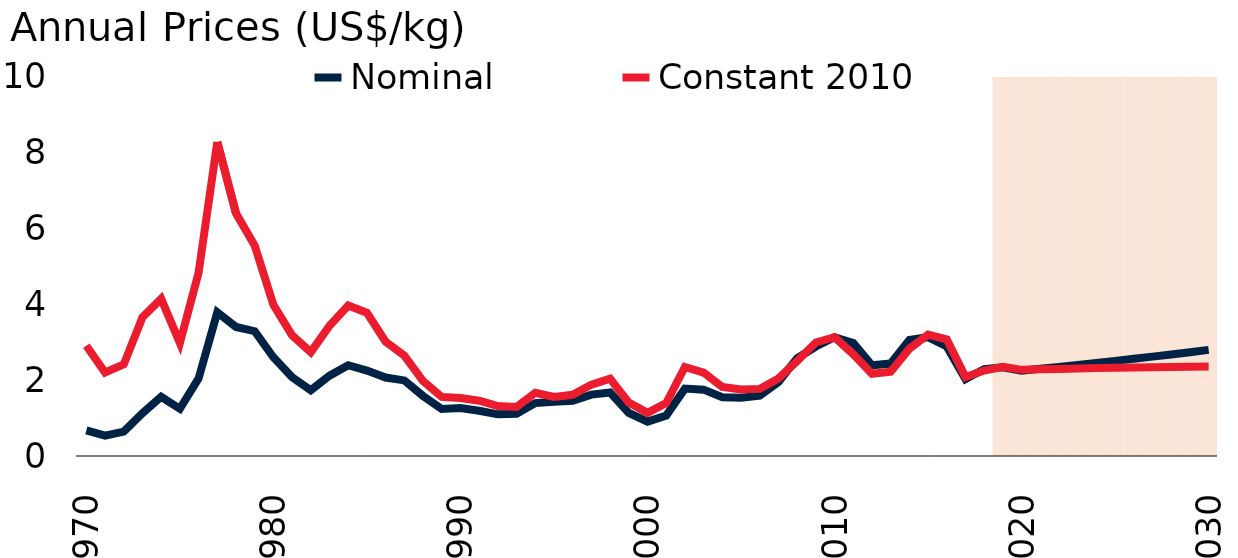
| Category | Series 2 |
|---|---|
| 1970.0 | 0 |
| 1971.0 | 0 |
| 1972.0 | 0 |
| 1973.0 | 0 |
| 1974.0 | 0 |
| 1975.0 | 0 |
| 1976.0 | 0 |
| 1977.0 | 0 |
| 1978.0 | 0 |
| 1979.0 | 0 |
| 1980.0 | 0 |
| 1981.0 | 0 |
| 1982.0 | 0 |
| 1983.0 | 0 |
| 1984.0 | 0 |
| 1985.0 | 0 |
| 1986.0 | 0 |
| 1987.0 | 0 |
| 1988.0 | 0 |
| 1989.0 | 0 |
| 1990.0 | 0 |
| 1991.0 | 0 |
| 1992.0 | 0 |
| 1993.0 | 0 |
| 1994.0 | 0 |
| 1995.0 | 0 |
| 1996.0 | 0 |
| 1997.0 | 0 |
| 1998.0 | 0 |
| 1999.0 | 0 |
| 2000.0 | 0 |
| 2001.0 | 0 |
| 2002.0 | 0 |
| 2003.0 | 0 |
| 2004.0 | 0 |
| 2005.0 | 0 |
| 2006.0 | 0 |
| 2007.0 | 0 |
| 2008.0 | 0 |
| 2009.0 | 0 |
| 2010.0 | 0 |
| 2011.0 | 0 |
| 2012.0 | 0 |
| 2013.0 | 0 |
| 2014.0 | 0 |
| 2015.0 | 0 |
| 2016.0 | 0 |
| 2017.0 | 0 |
| 2018.0 | 0 |
| 2019.0 | 10 |
| 2020.0 | 10 |
| 2021.0 | 10 |
| 2022.0 | 10 |
| 2023.0 | 10 |
| 2024.0 | 10 |
| 2025.0 | 10 |
| 2026.0 | 10 |
| 2027.0 | 10 |
| 2028.0 | 10 |
| 2029.0 | 10 |
| 2030.0 | 10 |